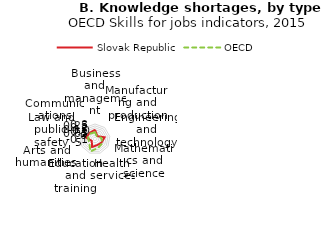
| Category | Slovak Republic | OECD |
|---|---|---|
| Business and management | 0.147 | 0.079 |
| Manufacturing and production | -0.001 | -0.017 |
| Engineering and technology | 0.16 | 0.072 |
| Mathematics and science | 0.097 | 0.125 |
| Health services | 0.073 | 0.15 |
| Education and training | 0.126 | 0.254 |
| Arts and humanities | 0 | 0.079 |
| Law and public safety | 0.148 | 0.086 |
| Communications | 0.115 | 0.09 |